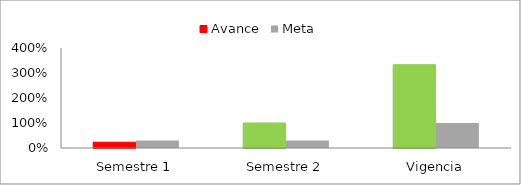
| Category | Avance | Meta |
|---|---|---|
| Semestre 1 | 0.233 | 0.3 |
| Semestre 2 | 1 | 0.3 |
| Vigencia | 3.333 | 1 |